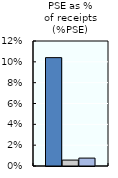
| Category | 1986-88 | 2000-02 | 2016-18 |
|---|---|---|---|
| PSE as %
of receipts (%PSE) | 0.104 | 0.006 | 0.008 |